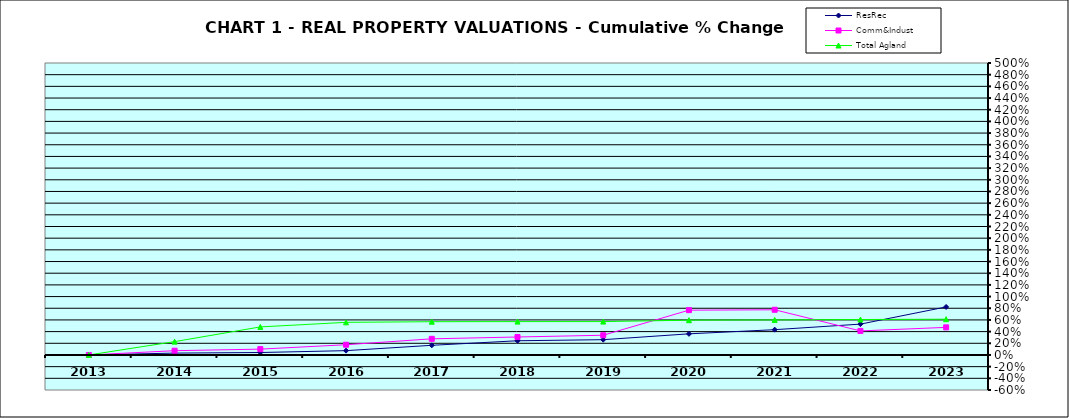
| Category | ResRec | Comm&Indust | Total Agland |
|---|---|---|---|
| 2013.0 | 0 | 0 | 0 |
| 2014.0 | 0.032 | 0.073 | 0.228 |
| 2015.0 | 0.042 | 0.1 | 0.48 |
| 2016.0 | 0.074 | 0.175 | 0.559 |
| 2017.0 | 0.166 | 0.276 | 0.57 |
| 2018.0 | 0.243 | 0.308 | 0.571 |
| 2019.0 | 0.262 | 0.338 | 0.572 |
| 2020.0 | 0.362 | 0.767 | 0.595 |
| 2021.0 | 0.433 | 0.774 | 0.6 |
| 2022.0 | 0.528 | 0.412 | 0.607 |
| 2023.0 | 0.823 | 0.472 | 0.612 |